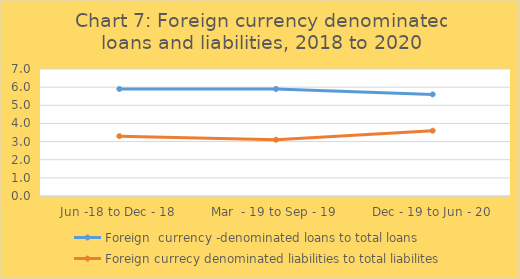
| Category | Foreign  currency -denominated loans to total loans | Foreign currecy denominated liabilities to total liabilites |
|---|---|---|
| Jun -18 to Dec - 18 | 5.9 | 3.3 |
| Mar  - 19 to Sep - 19 | 5.9 | 3.1 |
| Dec - 19 to Jun - 20 | 5.6 | 3.6 |